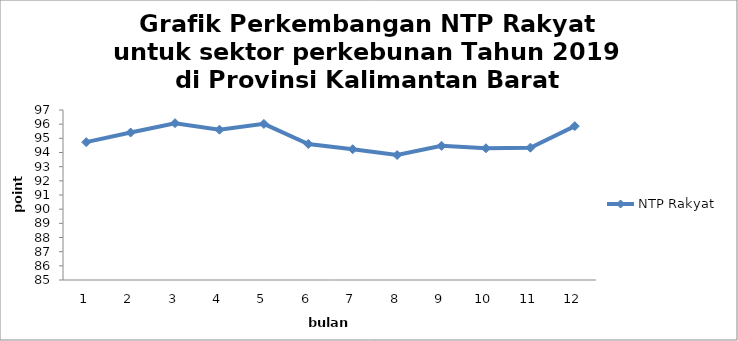
| Category | NTP Rakyat  |
|---|---|
| 0 | 94.73 |
| 1 | 95.41 |
| 2 | 96.07 |
| 3 | 95.61 |
| 4 | 96.02 |
| 5 | 94.6 |
| 6 | 94.23 |
| 7 | 93.82 |
| 8 | 94.47 |
| 9 | 94.3 |
| 10 | 94.34 |
| 11 | 95.86 |